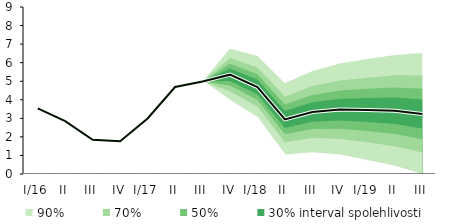
| Category | linka | Centerline |
|---|---|---|
| I/16 | 3.541 | 3.541 |
| II | 2.848 | 2.848 |
| III | 1.844 | 1.844 |
| IV | 1.766 | 1.766 |
| I/17 | 2.992 | 2.992 |
| II | 4.69 | 4.69 |
| III | 4.984 | 4.984 |
| IV | 5.354 | 5.354 |
| I/18 | 4.682 | 4.682 |
| II | 2.944 | 2.944 |
| III | 3.336 | 3.336 |
| IV | 3.472 | 3.472 |
| I/19 | 3.449 | 3.449 |
| II | 3.406 | 3.406 |
| III | 3.235 | 3.235 |